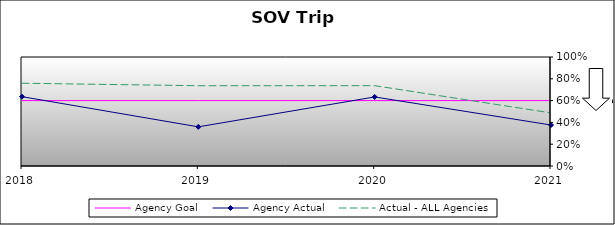
| Category | Agency Goal | Agency Actual | Actual - ALL Agencies |
|---|---|---|---|
| 2018.0 | 0.6 | 0.636 | 0.759 |
| 2019.0 | 0.6 | 0.359 | 0.736 |
| 2020.0 | 0.6 | 0.634 | 0.737 |
| 2021.0 | 0.6 | 0.376 | 0.487 |